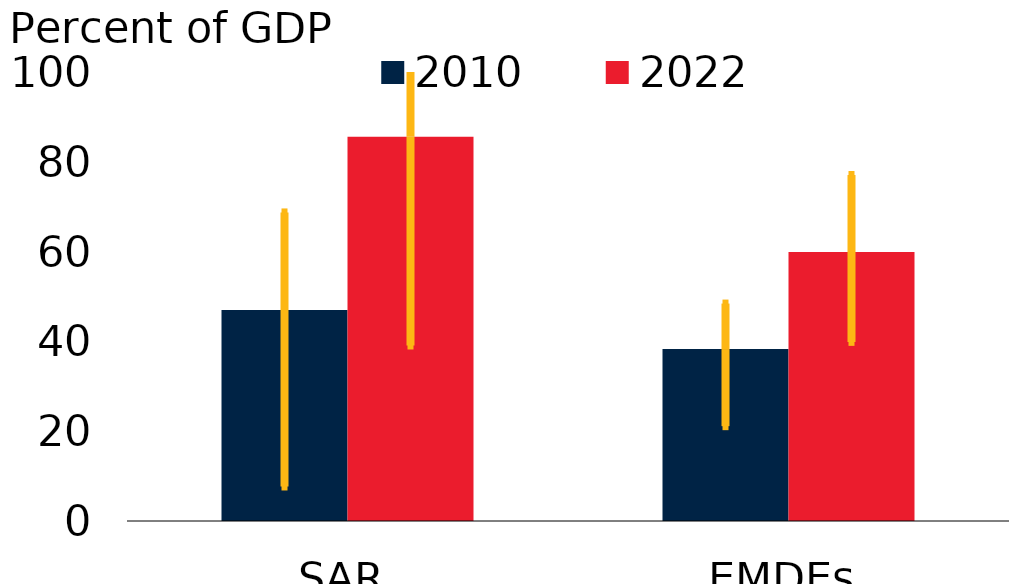
| Category | 2010 | 2022 |
|---|---|---|
| SAR | 47 | 85.6 |
| EMDEs | 38.3 | 59.9 |